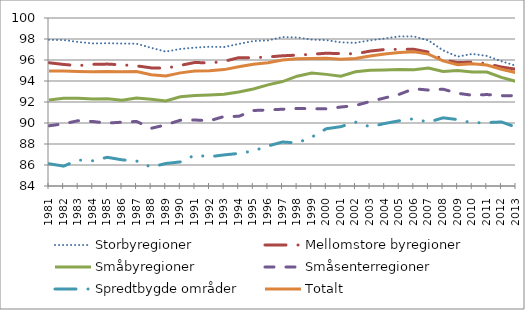
| Category | Storbyregioner | Mellomstore byregioner | Småbyregioner | Småsenterregioner | Spredtbygde områder | Totalt |
|---|---|---|---|---|---|---|
| 1981.0 | 97.923 | 95.737 | 92.199 | 89.732 | 86.121 | 94.964 |
| 1982.0 | 97.902 | 95.576 | 92.365 | 89.923 | 85.893 | 94.952 |
| 1983.0 | 97.718 | 95.462 | 92.349 | 90.22 | 86.471 | 94.906 |
| 1984.0 | 97.58 | 95.586 | 92.294 | 90.141 | 86.403 | 94.876 |
| 1985.0 | 97.595 | 95.61 | 92.3 | 89.99 | 86.733 | 94.902 |
| 1986.0 | 97.568 | 95.538 | 92.177 | 90.079 | 86.492 | 94.87 |
| 1987.0 | 97.551 | 95.445 | 92.379 | 90.147 | 86.379 | 94.898 |
| 1988.0 | 97.161 | 95.249 | 92.251 | 89.495 | 85.8 | 94.593 |
| 1989.0 | 96.8 | 95.214 | 92.102 | 89.818 | 86.142 | 94.472 |
| 1990.0 | 97.049 | 95.485 | 92.503 | 90.268 | 86.293 | 94.775 |
| 1991.0 | 97.18 | 95.767 | 92.614 | 90.288 | 86.947 | 94.962 |
| 1992.0 | 97.262 | 95.714 | 92.671 | 90.209 | 86.784 | 94.984 |
| 1993.0 | 97.236 | 95.872 | 92.737 | 90.621 | 86.962 | 95.086 |
| 1994.0 | 97.53 | 96.222 | 92.954 | 90.634 | 87.099 | 95.359 |
| 1995.0 | 97.803 | 96.218 | 93.242 | 91.191 | 87.346 | 95.598 |
| 1996.0 | 97.865 | 96.285 | 93.631 | 91.24 | 87.806 | 95.744 |
| 1997.0 | 98.182 | 96.402 | 93.949 | 91.312 | 88.192 | 96.004 |
| 1998.0 | 98.148 | 96.464 | 94.46 | 91.382 | 88.097 | 96.118 |
| 1999.0 | 97.944 | 96.546 | 94.752 | 91.365 | 88.651 | 96.14 |
| 2000.0 | 97.892 | 96.644 | 94.631 | 91.351 | 89.451 | 96.165 |
| 2001.0 | 97.682 | 96.606 | 94.46 | 91.521 | 89.653 | 96.07 |
| 2002.0 | 97.635 | 96.588 | 94.872 | 91.666 | 90.091 | 96.153 |
| 2003.0 | 97.874 | 96.848 | 95.03 | 92.044 | 89.642 | 96.39 |
| 2004.0 | 98.043 | 96.998 | 95.049 | 92.388 | 89.955 | 96.562 |
| 2005.0 | 98.249 | 97.017 | 95.085 | 92.732 | 90.21 | 96.718 |
| 2006.0 | 98.244 | 97.021 | 95.082 | 93.262 | 90.407 | 96.786 |
| 2007.0 | 97.864 | 96.754 | 95.23 | 93.137 | 90.078 | 96.563 |
| 2008.0 | 96.919 | 96.026 | 94.908 | 93.222 | 90.493 | 95.91 |
| 2009.0 | 96.32 | 95.748 | 94.99 | 92.833 | 90.325 | 95.542 |
| 2010.0 | 96.583 | 95.796 | 94.847 | 92.642 | 90.017 | 95.64 |
| 2011.0 | 96.388 | 95.647 | 94.848 | 92.711 | 90.04 | 95.52 |
| 2012.0 | 95.882 | 95.332 | 94.348 | 92.604 | 90.099 | 95.121 |
| 2013.0 | 95.454 | 95.121 | 93.966 | 92.606 | 89.603 | 94.798 |